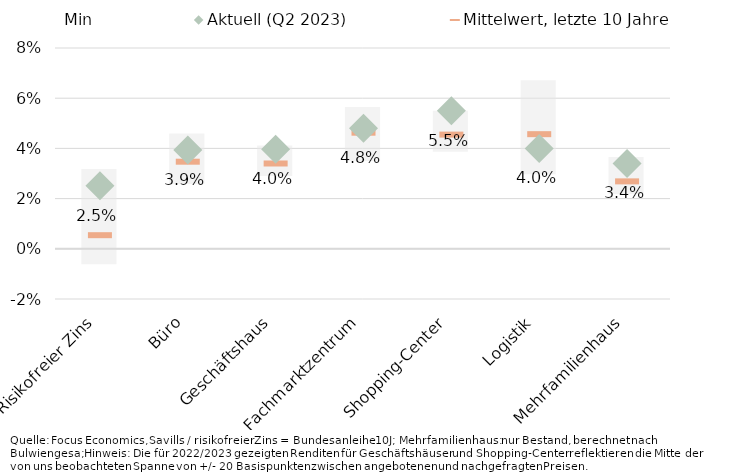
| Category | Min | Spanne Min/Max, letzte 10 Jahre |
|---|---|---|
| Risikofreier Zins | -0.006 | 0.032 |
| Büro | 0.026 | 0.02 |
| Geschäftshaus | 0.029 | 0.012 |
| Fachmarktzentrum | 0.035 | 0.022 |
| Shopping-Center | 0.039 | 0.016 |
| Logistik | 0.03 | 0.037 |
| Mehrfamilienhaus | 0.022 | 0.015 |